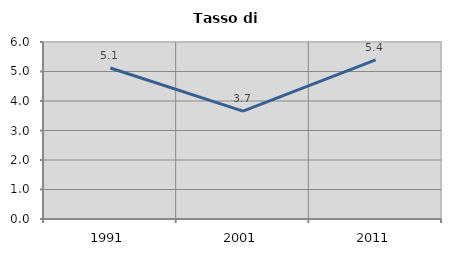
| Category | Tasso di disoccupazione   |
|---|---|
| 1991.0 | 5.118 |
| 2001.0 | 3.654 |
| 2011.0 | 5.391 |